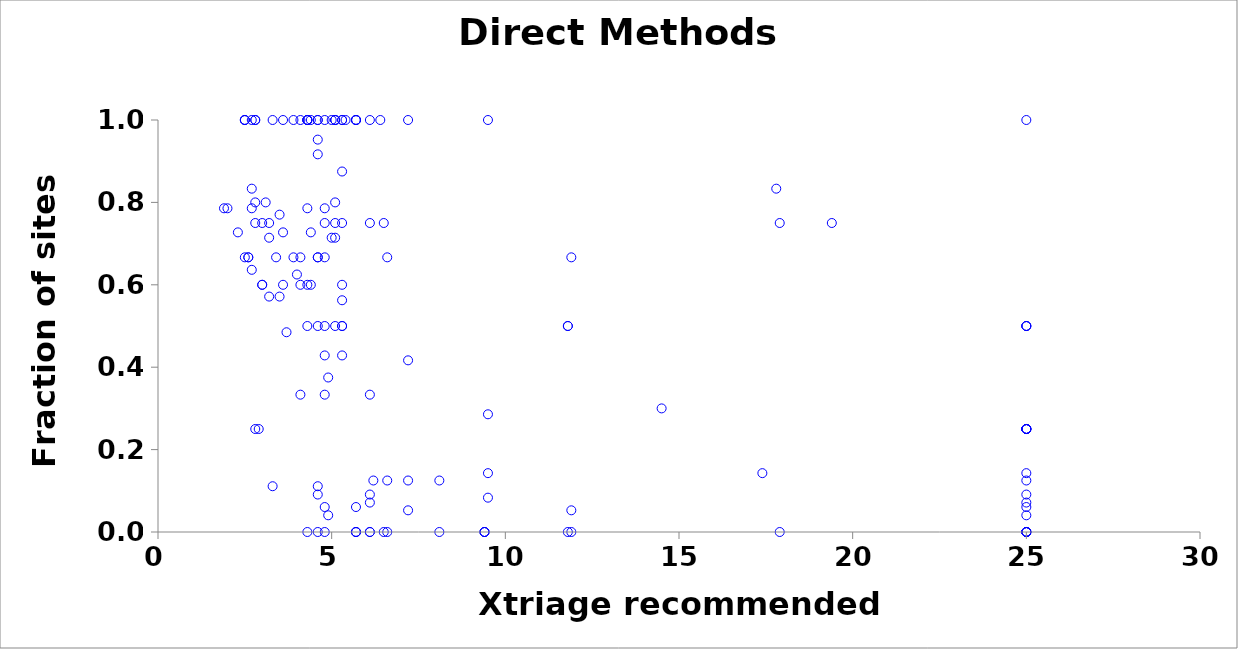
| Category | LLGC |
|---|---|
| 5.7 | 0 |
| 4.6 | 1 |
| 9.4 | 0 |
| 8.1 | 0 |
| 5.1 | 1 |
| 5.7 | 1 |
| 25.0 | 1 |
| 25.0 | 0 |
| 4.6 | 0.667 |
| 4.1 | 0.333 |
| 2.6 | 0.667 |
| 17.9 | 0 |
| 6.1 | 0.333 |
| 25.0 | 0 |
| 4.8 | 1 |
| 4.8 | 0.667 |
| 11.9 | 0.667 |
| 4.1 | 1 |
| 4.1 | 0.667 |
| 3.6 | 1 |
| 3.9 | 0.667 |
| 3.4 | 0.667 |
| 2.6 | 0.667 |
| 25.0 | 0.25 |
| 25.0 | 0 |
| 25.0 | 0.25 |
| 25.0 | 0.25 |
| 25.0 | 0 |
| 25.0 | 0.5 |
| 25.0 | 0.5 |
| 5.3 | 0.5 |
| 5.3 | 0.5 |
| 4.6 | 0.5 |
| 5.7 | 0 |
| 17.9 | 0.75 |
| 4.6 | 1 |
| 7.2 | 1 |
| 6.1 | 0.75 |
| 25.0 | 0.25 |
| 4.3 | 1 |
| 11.8 | 0.5 |
| 5.1 | 1 |
| 19.4 | 0.75 |
| 4.3 | 1 |
| 6.4 | 1 |
| 9.5 | 1 |
| 5.7 | 1 |
| 5.7 | 1 |
| 6.5 | 0.75 |
| 11.8 | 0 |
| 4.3 | 0.6 |
| 3.0 | 0.6 |
| 6.5 | 0 |
| 5.3 | 0.6 |
| 4.1 | 0.6 |
| 5.1 | 0.8 |
| 5.1 | 1 |
| 3.1 | 0.8 |
| 6.1 | 0 |
| 6.6 | 0 |
| 3.0 | 0.6 |
| 5.3 | 1 |
| 6.1 | 1 |
| 5.0 | 1 |
| 5.4 | 1 |
| 4.4 | 1 |
| 3.9 | 1 |
| 4.3 | 1 |
| 4.3 | 1 |
| 5.7 | 1 |
| 2.7 | 1 |
| 2.5 | 1 |
| 2.5 | 1 |
| 2.8 | 1 |
| 2.5 | 1 |
| 9.5 | 0.143 |
| 3.5 | 0.571 |
| 17.4 | 0.143 |
| 3.2 | 0.571 |
| 9.5 | 0.286 |
| 5.3 | 0.429 |
| 25.0 | 0.125 |
| 8.1 | 0.125 |
| 25.0 | 0.25 |
| 2.9 | 0.25 |
| 25.0 | 0.25 |
| 2.8 | 0.25 |
| 5.3 | 1 |
| 4.8 | 0 |
| 6.1 | 0 |
| 25.0 | 0.5 |
| 6.2 | 0.125 |
| 4.9 | 0.375 |
| 11.9 | 0 |
| 25.0 | 0 |
| 3.3 | 1 |
| 9.4 | 0 |
| 4.8 | 0.5 |
| 4.6 | 0 |
| 6.6 | 0.125 |
| 9.4 | 0 |
| 5.3 | 0.875 |
| 2.8 | 1 |
| 5.7 | 0 |
| 3.0 | 0.75 |
| 4.3 | 0 |
| 6.6 | 0.667 |
| 4.6 | 0.667 |
| 2.5 | 0.667 |
| 14.5 | 0.3 |
| 25.0 | 0 |
| 5.1 | 0.5 |
| 4.4 | 0.6 |
| 11.8 | 0.5 |
| 3.6 | 0.6 |
| 2.8 | 0.8 |
| 4.3 | 0.5 |
| 4.6 | 0.091 |
| 25.0 | 0.091 |
| 3.6 | 0.727 |
| 2.7 | 0.636 |
| 2.3 | 0.727 |
| 4.6 | 0.917 |
| 5.3 | 0.75 |
| 2.8 | 0.75 |
| 9.5 | 0.083 |
| 7.2 | 0.417 |
| 5.1 | 0.75 |
| 4.8 | 0.75 |
| 25.0 | 0.143 |
| 25.0 | 0.071 |
| 6.1 | 0.071 |
| 4.8 | 0.429 |
| 4.3 | 0.786 |
| 3.2 | 0.714 |
| 2.7 | 0.786 |
| 5.0 | 0.714 |
| 4.8 | 0.786 |
| 2.0 | 0.786 |
| 1.9 | 0.786 |
| 4.0 | 0.625 |
| 7.2 | 0.125 |
| 5.3 | 0.562 |
| 3.2 | 0.75 |
| 17.8 | 0.833 |
| 2.7 | 0.833 |
| 5.1 | 0.714 |
| 4.6 | 0.952 |
| 6.1 | 0.091 |
| 4.4 | 0.727 |
| 3.3 | 0.111 |
| 4.8 | 0.333 |
| 4.6 | 0.111 |
| 5.7 | 0.061 |
| 4.8 | 0.061 |
| 3.7 | 0.485 |
| 7.2 | 0.053 |
| 11.9 | 0.053 |
| 25.0 | 0.061 |
| 4.9 | 0.041 |
| 25.0 | 0.041 |
| 3.5 | 0.77 |